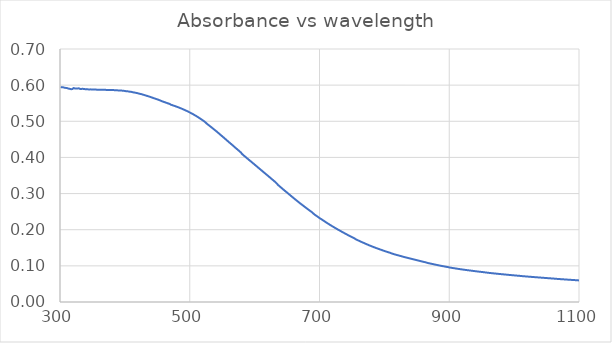
| Category | Series 0 |
|---|---|
| 1100.0 | 0.06 |
| 1099.0 | 0.06 |
| 1098.0 | 0.06 |
| 1097.0 | 0.06 |
| 1096.0 | 0.06 |
| 1095.0 | 0.06 |
| 1094.0 | 0.06 |
| 1093.0 | 0.061 |
| 1092.0 | 0.061 |
| 1091.0 | 0.061 |
| 1090.0 | 0.061 |
| 1089.0 | 0.061 |
| 1088.0 | 0.061 |
| 1087.0 | 0.061 |
| 1086.0 | 0.061 |
| 1085.0 | 0.062 |
| 1084.0 | 0.062 |
| 1083.0 | 0.062 |
| 1082.0 | 0.062 |
| 1081.0 | 0.062 |
| 1080.0 | 0.062 |
| 1079.0 | 0.062 |
| 1078.0 | 0.062 |
| 1077.0 | 0.063 |
| 1076.0 | 0.063 |
| 1075.0 | 0.063 |
| 1074.0 | 0.063 |
| 1073.0 | 0.063 |
| 1072.0 | 0.063 |
| 1071.0 | 0.063 |
| 1070.0 | 0.063 |
| 1069.0 | 0.064 |
| 1068.0 | 0.064 |
| 1067.0 | 0.064 |
| 1066.0 | 0.064 |
| 1065.0 | 0.064 |
| 1064.0 | 0.064 |
| 1063.0 | 0.065 |
| 1062.0 | 0.065 |
| 1061.0 | 0.065 |
| 1060.0 | 0.065 |
| 1059.0 | 0.065 |
| 1058.0 | 0.065 |
| 1057.0 | 0.065 |
| 1056.0 | 0.065 |
| 1055.0 | 0.066 |
| 1054.0 | 0.066 |
| 1053.0 | 0.066 |
| 1052.0 | 0.066 |
| 1051.0 | 0.066 |
| 1050.0 | 0.066 |
| 1049.0 | 0.066 |
| 1048.0 | 0.067 |
| 1047.0 | 0.067 |
| 1046.0 | 0.067 |
| 1045.0 | 0.067 |
| 1044.0 | 0.067 |
| 1043.0 | 0.067 |
| 1042.0 | 0.067 |
| 1041.0 | 0.068 |
| 1040.0 | 0.068 |
| 1039.0 | 0.068 |
| 1038.0 | 0.068 |
| 1037.0 | 0.068 |
| 1036.0 | 0.068 |
| 1035.0 | 0.068 |
| 1034.0 | 0.068 |
| 1033.0 | 0.069 |
| 1032.0 | 0.069 |
| 1031.0 | 0.069 |
| 1030.0 | 0.069 |
| 1029.0 | 0.069 |
| 1028.0 | 0.069 |
| 1027.0 | 0.069 |
| 1026.0 | 0.07 |
| 1025.0 | 0.07 |
| 1024.0 | 0.07 |
| 1023.0 | 0.07 |
| 1022.0 | 0.07 |
| 1021.0 | 0.07 |
| 1020.0 | 0.07 |
| 1019.0 | 0.071 |
| 1018.0 | 0.071 |
| 1017.0 | 0.071 |
| 1016.0 | 0.071 |
| 1015.0 | 0.071 |
| 1014.0 | 0.071 |
| 1013.0 | 0.072 |
| 1012.0 | 0.072 |
| 1011.0 | 0.072 |
| 1010.0 | 0.072 |
| 1009.0 | 0.072 |
| 1008.0 | 0.072 |
| 1007.0 | 0.073 |
| 1006.0 | 0.073 |
| 1005.0 | 0.073 |
| 1004.0 | 0.073 |
| 1003.0 | 0.073 |
| 1002.0 | 0.073 |
| 1001.0 | 0.074 |
| 1000.0 | 0.074 |
| 999.0 | 0.074 |
| 998.0 | 0.074 |
| 997.0 | 0.074 |
| 996.0 | 0.074 |
| 995.0 | 0.075 |
| 994.0 | 0.075 |
| 993.0 | 0.075 |
| 992.0 | 0.075 |
| 991.0 | 0.075 |
| 990.0 | 0.075 |
| 989.0 | 0.076 |
| 988.0 | 0.076 |
| 987.0 | 0.076 |
| 986.0 | 0.076 |
| 985.0 | 0.076 |
| 984.0 | 0.076 |
| 983.0 | 0.077 |
| 982.0 | 0.077 |
| 981.0 | 0.077 |
| 980.0 | 0.077 |
| 979.0 | 0.077 |
| 978.0 | 0.077 |
| 977.0 | 0.078 |
| 976.0 | 0.078 |
| 975.0 | 0.078 |
| 974.0 | 0.078 |
| 973.0 | 0.078 |
| 972.0 | 0.079 |
| 971.0 | 0.079 |
| 970.0 | 0.079 |
| 969.0 | 0.079 |
| 968.0 | 0.079 |
| 967.0 | 0.079 |
| 966.0 | 0.08 |
| 965.0 | 0.08 |
| 964.0 | 0.08 |
| 963.0 | 0.08 |
| 962.0 | 0.08 |
| 961.0 | 0.081 |
| 960.0 | 0.081 |
| 959.0 | 0.081 |
| 958.0 | 0.081 |
| 957.0 | 0.081 |
| 956.0 | 0.082 |
| 955.0 | 0.082 |
| 954.0 | 0.082 |
| 953.0 | 0.082 |
| 952.0 | 0.083 |
| 951.0 | 0.083 |
| 950.0 | 0.083 |
| 949.0 | 0.083 |
| 948.0 | 0.084 |
| 947.0 | 0.084 |
| 946.0 | 0.084 |
| 945.0 | 0.084 |
| 944.0 | 0.084 |
| 943.0 | 0.085 |
| 942.0 | 0.085 |
| 941.0 | 0.085 |
| 940.0 | 0.085 |
| 939.0 | 0.086 |
| 938.0 | 0.086 |
| 937.0 | 0.086 |
| 936.0 | 0.086 |
| 935.0 | 0.086 |
| 934.0 | 0.087 |
| 933.0 | 0.087 |
| 932.0 | 0.087 |
| 931.0 | 0.087 |
| 930.0 | 0.088 |
| 929.0 | 0.088 |
| 928.0 | 0.088 |
| 927.0 | 0.088 |
| 926.0 | 0.089 |
| 925.0 | 0.089 |
| 924.0 | 0.089 |
| 923.0 | 0.089 |
| 922.0 | 0.09 |
| 921.0 | 0.09 |
| 920.0 | 0.09 |
| 919.0 | 0.09 |
| 918.0 | 0.091 |
| 917.0 | 0.091 |
| 916.0 | 0.091 |
| 915.0 | 0.091 |
| 914.0 | 0.092 |
| 913.0 | 0.092 |
| 912.0 | 0.092 |
| 911.0 | 0.092 |
| 910.0 | 0.093 |
| 909.0 | 0.093 |
| 908.0 | 0.093 |
| 907.0 | 0.094 |
| 906.0 | 0.094 |
| 905.0 | 0.094 |
| 904.0 | 0.094 |
| 903.0 | 0.095 |
| 902.0 | 0.095 |
| 901.0 | 0.095 |
| 900.0 | 0.096 |
| 899.0 | 0.096 |
| 898.0 | 0.097 |
| 897.0 | 0.097 |
| 896.0 | 0.097 |
| 895.0 | 0.098 |
| 894.0 | 0.098 |
| 893.0 | 0.098 |
| 892.0 | 0.099 |
| 891.0 | 0.099 |
| 890.0 | 0.099 |
| 889.0 | 0.1 |
| 888.0 | 0.1 |
| 887.0 | 0.1 |
| 886.0 | 0.101 |
| 885.0 | 0.101 |
| 884.0 | 0.101 |
| 883.0 | 0.102 |
| 882.0 | 0.102 |
| 881.0 | 0.102 |
| 880.0 | 0.103 |
| 879.0 | 0.103 |
| 878.0 | 0.104 |
| 877.0 | 0.104 |
| 876.0 | 0.104 |
| 875.0 | 0.105 |
| 874.0 | 0.105 |
| 873.0 | 0.106 |
| 872.0 | 0.106 |
| 871.0 | 0.106 |
| 870.0 | 0.107 |
| 869.0 | 0.107 |
| 868.0 | 0.108 |
| 867.0 | 0.108 |
| 866.0 | 0.108 |
| 865.0 | 0.109 |
| 864.0 | 0.11 |
| 863.0 | 0.11 |
| 862.0 | 0.11 |
| 861.0 | 0.111 |
| 860.0 | 0.111 |
| 859.0 | 0.112 |
| 858.0 | 0.112 |
| 857.0 | 0.113 |
| 856.0 | 0.113 |
| 855.0 | 0.114 |
| 854.0 | 0.114 |
| 853.0 | 0.114 |
| 852.0 | 0.115 |
| 851.0 | 0.115 |
| 850.0 | 0.116 |
| 849.0 | 0.116 |
| 848.0 | 0.117 |
| 847.0 | 0.117 |
| 846.0 | 0.118 |
| 845.0 | 0.118 |
| 844.0 | 0.118 |
| 843.0 | 0.119 |
| 842.0 | 0.119 |
| 841.0 | 0.12 |
| 840.0 | 0.12 |
| 839.0 | 0.121 |
| 838.0 | 0.121 |
| 837.0 | 0.122 |
| 836.0 | 0.122 |
| 835.0 | 0.122 |
| 834.0 | 0.123 |
| 833.0 | 0.123 |
| 832.0 | 0.124 |
| 831.0 | 0.124 |
| 830.0 | 0.125 |
| 829.0 | 0.125 |
| 828.0 | 0.126 |
| 827.0 | 0.126 |
| 826.0 | 0.127 |
| 825.0 | 0.127 |
| 824.0 | 0.128 |
| 823.0 | 0.128 |
| 822.0 | 0.129 |
| 821.0 | 0.129 |
| 820.0 | 0.13 |
| 819.0 | 0.13 |
| 818.0 | 0.131 |
| 817.0 | 0.131 |
| 816.0 | 0.132 |
| 815.0 | 0.132 |
| 814.0 | 0.133 |
| 813.0 | 0.133 |
| 812.0 | 0.134 |
| 811.0 | 0.134 |
| 810.0 | 0.135 |
| 809.0 | 0.136 |
| 808.0 | 0.137 |
| 807.0 | 0.137 |
| 806.0 | 0.138 |
| 805.0 | 0.138 |
| 804.0 | 0.139 |
| 803.0 | 0.139 |
| 802.0 | 0.14 |
| 801.0 | 0.141 |
| 800.0 | 0.141 |
| 799.0 | 0.142 |
| 798.0 | 0.142 |
| 797.0 | 0.143 |
| 796.0 | 0.144 |
| 795.0 | 0.144 |
| 794.0 | 0.145 |
| 793.0 | 0.146 |
| 792.0 | 0.146 |
| 791.0 | 0.147 |
| 790.0 | 0.148 |
| 789.0 | 0.148 |
| 788.0 | 0.149 |
| 787.0 | 0.15 |
| 786.0 | 0.15 |
| 785.0 | 0.151 |
| 784.0 | 0.152 |
| 783.0 | 0.152 |
| 782.0 | 0.153 |
| 781.0 | 0.154 |
| 780.0 | 0.154 |
| 779.0 | 0.155 |
| 778.0 | 0.156 |
| 777.0 | 0.157 |
| 776.0 | 0.157 |
| 775.0 | 0.158 |
| 774.0 | 0.159 |
| 773.0 | 0.16 |
| 772.0 | 0.16 |
| 771.0 | 0.161 |
| 770.0 | 0.162 |
| 769.0 | 0.163 |
| 768.0 | 0.164 |
| 767.0 | 0.164 |
| 766.0 | 0.165 |
| 765.0 | 0.166 |
| 764.0 | 0.167 |
| 763.0 | 0.168 |
| 762.0 | 0.168 |
| 761.0 | 0.169 |
| 760.0 | 0.17 |
| 759.0 | 0.171 |
| 758.0 | 0.172 |
| 757.0 | 0.173 |
| 756.0 | 0.173 |
| 755.0 | 0.175 |
| 754.0 | 0.176 |
| 753.0 | 0.177 |
| 752.0 | 0.178 |
| 751.0 | 0.179 |
| 750.0 | 0.18 |
| 749.0 | 0.18 |
| 748.0 | 0.181 |
| 747.0 | 0.182 |
| 746.0 | 0.183 |
| 745.0 | 0.184 |
| 744.0 | 0.185 |
| 743.0 | 0.186 |
| 742.0 | 0.187 |
| 741.0 | 0.188 |
| 740.0 | 0.189 |
| 739.0 | 0.19 |
| 738.0 | 0.191 |
| 737.0 | 0.192 |
| 736.0 | 0.193 |
| 735.0 | 0.194 |
| 734.0 | 0.195 |
| 733.0 | 0.196 |
| 732.0 | 0.197 |
| 731.0 | 0.198 |
| 730.0 | 0.199 |
| 729.0 | 0.2 |
| 728.0 | 0.201 |
| 727.0 | 0.202 |
| 726.0 | 0.203 |
| 725.0 | 0.204 |
| 724.0 | 0.205 |
| 723.0 | 0.206 |
| 722.0 | 0.207 |
| 721.0 | 0.208 |
| 720.0 | 0.209 |
| 719.0 | 0.21 |
| 718.0 | 0.211 |
| 717.0 | 0.213 |
| 716.0 | 0.214 |
| 715.0 | 0.215 |
| 714.0 | 0.216 |
| 713.0 | 0.217 |
| 712.0 | 0.218 |
| 711.0 | 0.219 |
| 710.0 | 0.221 |
| 709.0 | 0.222 |
| 708.0 | 0.223 |
| 707.0 | 0.224 |
| 706.0 | 0.225 |
| 705.0 | 0.227 |
| 704.0 | 0.228 |
| 703.0 | 0.229 |
| 702.0 | 0.23 |
| 701.0 | 0.231 |
| 700.0 | 0.232 |
| 699.0 | 0.234 |
| 698.0 | 0.235 |
| 697.0 | 0.236 |
| 696.0 | 0.237 |
| 695.0 | 0.239 |
| 694.0 | 0.24 |
| 693.0 | 0.241 |
| 692.0 | 0.242 |
| 691.0 | 0.244 |
| 690.0 | 0.246 |
| 689.0 | 0.248 |
| 688.0 | 0.249 |
| 687.0 | 0.25 |
| 686.0 | 0.252 |
| 685.0 | 0.253 |
| 684.0 | 0.254 |
| 683.0 | 0.256 |
| 682.0 | 0.257 |
| 681.0 | 0.258 |
| 680.0 | 0.26 |
| 679.0 | 0.261 |
| 678.0 | 0.262 |
| 677.0 | 0.264 |
| 676.0 | 0.265 |
| 675.0 | 0.266 |
| 674.0 | 0.268 |
| 673.0 | 0.269 |
| 672.0 | 0.27 |
| 671.0 | 0.272 |
| 670.0 | 0.273 |
| 669.0 | 0.275 |
| 668.0 | 0.276 |
| 667.0 | 0.278 |
| 666.0 | 0.279 |
| 665.0 | 0.28 |
| 664.0 | 0.282 |
| 663.0 | 0.283 |
| 662.0 | 0.285 |
| 661.0 | 0.286 |
| 660.0 | 0.288 |
| 659.0 | 0.289 |
| 658.0 | 0.291 |
| 657.0 | 0.292 |
| 656.0 | 0.294 |
| 655.0 | 0.295 |
| 654.0 | 0.297 |
| 653.0 | 0.298 |
| 652.0 | 0.3 |
| 651.0 | 0.301 |
| 650.0 | 0.303 |
| 649.0 | 0.304 |
| 648.0 | 0.306 |
| 647.0 | 0.307 |
| 646.0 | 0.309 |
| 645.0 | 0.31 |
| 644.0 | 0.312 |
| 643.0 | 0.313 |
| 642.0 | 0.315 |
| 641.0 | 0.316 |
| 640.0 | 0.318 |
| 639.0 | 0.319 |
| 638.0 | 0.321 |
| 637.0 | 0.322 |
| 636.0 | 0.324 |
| 635.0 | 0.325 |
| 634.0 | 0.328 |
| 633.0 | 0.33 |
| 632.0 | 0.332 |
| 631.0 | 0.333 |
| 630.0 | 0.335 |
| 629.0 | 0.336 |
| 628.0 | 0.338 |
| 627.0 | 0.339 |
| 626.0 | 0.341 |
| 625.0 | 0.342 |
| 624.0 | 0.344 |
| 623.0 | 0.345 |
| 622.0 | 0.347 |
| 621.0 | 0.348 |
| 620.0 | 0.35 |
| 619.0 | 0.351 |
| 618.0 | 0.353 |
| 617.0 | 0.354 |
| 616.0 | 0.356 |
| 615.0 | 0.358 |
| 614.0 | 0.359 |
| 613.0 | 0.361 |
| 612.0 | 0.362 |
| 611.0 | 0.364 |
| 610.0 | 0.365 |
| 609.0 | 0.367 |
| 608.0 | 0.368 |
| 607.0 | 0.37 |
| 606.0 | 0.371 |
| 605.0 | 0.373 |
| 604.0 | 0.374 |
| 603.0 | 0.376 |
| 602.0 | 0.377 |
| 601.0 | 0.379 |
| 600.0 | 0.38 |
| 599.0 | 0.382 |
| 598.0 | 0.383 |
| 597.0 | 0.385 |
| 596.0 | 0.386 |
| 595.0 | 0.388 |
| 594.0 | 0.389 |
| 593.0 | 0.391 |
| 592.0 | 0.392 |
| 591.0 | 0.394 |
| 590.0 | 0.395 |
| 589.0 | 0.397 |
| 588.0 | 0.398 |
| 587.0 | 0.4 |
| 586.0 | 0.401 |
| 585.0 | 0.403 |
| 584.0 | 0.404 |
| 583.0 | 0.406 |
| 582.0 | 0.407 |
| 581.0 | 0.409 |
| 580.0 | 0.411 |
| 579.0 | 0.414 |
| 578.0 | 0.415 |
| 577.0 | 0.417 |
| 576.0 | 0.418 |
| 575.0 | 0.42 |
| 574.0 | 0.421 |
| 573.0 | 0.423 |
| 572.0 | 0.424 |
| 571.0 | 0.426 |
| 570.0 | 0.427 |
| 569.0 | 0.429 |
| 568.0 | 0.431 |
| 567.0 | 0.432 |
| 566.0 | 0.434 |
| 565.0 | 0.435 |
| 564.0 | 0.437 |
| 563.0 | 0.438 |
| 562.0 | 0.44 |
| 561.0 | 0.441 |
| 560.0 | 0.443 |
| 559.0 | 0.444 |
| 558.0 | 0.446 |
| 557.0 | 0.448 |
| 556.0 | 0.449 |
| 555.0 | 0.451 |
| 554.0 | 0.452 |
| 553.0 | 0.454 |
| 552.0 | 0.455 |
| 551.0 | 0.457 |
| 550.0 | 0.458 |
| 549.0 | 0.46 |
| 548.0 | 0.462 |
| 547.0 | 0.463 |
| 546.0 | 0.465 |
| 545.0 | 0.466 |
| 544.0 | 0.468 |
| 543.0 | 0.469 |
| 542.0 | 0.471 |
| 541.0 | 0.472 |
| 540.0 | 0.474 |
| 539.0 | 0.475 |
| 538.0 | 0.477 |
| 537.0 | 0.478 |
| 536.0 | 0.48 |
| 535.0 | 0.481 |
| 534.0 | 0.483 |
| 533.0 | 0.484 |
| 532.0 | 0.485 |
| 531.0 | 0.487 |
| 530.0 | 0.488 |
| 529.0 | 0.49 |
| 528.0 | 0.491 |
| 527.0 | 0.492 |
| 526.0 | 0.494 |
| 525.0 | 0.496 |
| 524.0 | 0.498 |
| 523.0 | 0.499 |
| 522.0 | 0.5 |
| 521.0 | 0.501 |
| 520.0 | 0.503 |
| 519.0 | 0.504 |
| 518.0 | 0.505 |
| 517.0 | 0.506 |
| 516.0 | 0.508 |
| 515.0 | 0.509 |
| 514.0 | 0.51 |
| 513.0 | 0.511 |
| 512.0 | 0.512 |
| 511.0 | 0.513 |
| 510.0 | 0.515 |
| 509.0 | 0.516 |
| 508.0 | 0.517 |
| 507.0 | 0.518 |
| 506.0 | 0.519 |
| 505.0 | 0.52 |
| 504.0 | 0.521 |
| 503.0 | 0.522 |
| 502.0 | 0.523 |
| 501.0 | 0.524 |
| 500.0 | 0.524 |
| 499.0 | 0.525 |
| 498.0 | 0.526 |
| 497.0 | 0.527 |
| 496.0 | 0.528 |
| 495.0 | 0.529 |
| 494.0 | 0.53 |
| 493.0 | 0.531 |
| 492.0 | 0.531 |
| 491.0 | 0.532 |
| 490.0 | 0.533 |
| 489.0 | 0.534 |
| 488.0 | 0.535 |
| 487.0 | 0.535 |
| 486.0 | 0.536 |
| 485.0 | 0.537 |
| 484.0 | 0.537 |
| 483.0 | 0.538 |
| 482.0 | 0.539 |
| 481.0 | 0.54 |
| 480.0 | 0.54 |
| 479.0 | 0.541 |
| 478.0 | 0.541 |
| 477.0 | 0.542 |
| 476.0 | 0.543 |
| 475.0 | 0.543 |
| 474.0 | 0.544 |
| 473.0 | 0.545 |
| 472.0 | 0.545 |
| 471.0 | 0.546 |
| 470.0 | 0.547 |
| 469.0 | 0.548 |
| 468.0 | 0.549 |
| 467.0 | 0.549 |
| 466.0 | 0.55 |
| 465.0 | 0.55 |
| 464.0 | 0.551 |
| 463.0 | 0.552 |
| 462.0 | 0.552 |
| 461.0 | 0.553 |
| 460.0 | 0.554 |
| 459.0 | 0.554 |
| 458.0 | 0.555 |
| 457.0 | 0.556 |
| 456.0 | 0.556 |
| 455.0 | 0.557 |
| 454.0 | 0.558 |
| 453.0 | 0.559 |
| 452.0 | 0.559 |
| 451.0 | 0.56 |
| 450.0 | 0.561 |
| 449.0 | 0.561 |
| 448.0 | 0.562 |
| 447.0 | 0.562 |
| 446.0 | 0.563 |
| 445.0 | 0.564 |
| 444.0 | 0.564 |
| 443.0 | 0.565 |
| 442.0 | 0.566 |
| 441.0 | 0.566 |
| 440.0 | 0.567 |
| 439.0 | 0.568 |
| 438.0 | 0.568 |
| 437.0 | 0.569 |
| 436.0 | 0.569 |
| 435.0 | 0.57 |
| 434.0 | 0.57 |
| 433.0 | 0.571 |
| 432.0 | 0.572 |
| 431.0 | 0.572 |
| 430.0 | 0.573 |
| 429.0 | 0.573 |
| 428.0 | 0.574 |
| 427.0 | 0.574 |
| 426.0 | 0.575 |
| 425.0 | 0.575 |
| 424.0 | 0.576 |
| 423.0 | 0.576 |
| 422.0 | 0.577 |
| 421.0 | 0.577 |
| 420.0 | 0.577 |
| 419.0 | 0.578 |
| 418.0 | 0.578 |
| 417.0 | 0.579 |
| 416.0 | 0.579 |
| 415.0 | 0.579 |
| 414.0 | 0.58 |
| 413.0 | 0.58 |
| 412.0 | 0.581 |
| 411.0 | 0.581 |
| 410.0 | 0.581 |
| 409.0 | 0.582 |
| 408.0 | 0.582 |
| 407.0 | 0.582 |
| 406.0 | 0.582 |
| 405.0 | 0.583 |
| 404.0 | 0.583 |
| 403.0 | 0.583 |
| 402.0 | 0.583 |
| 401.0 | 0.584 |
| 400.0 | 0.584 |
| 399.0 | 0.584 |
| 398.0 | 0.584 |
| 397.0 | 0.585 |
| 396.0 | 0.585 |
| 395.0 | 0.585 |
| 394.0 | 0.585 |
| 393.0 | 0.585 |
| 392.0 | 0.585 |
| 391.0 | 0.585 |
| 390.0 | 0.586 |
| 389.0 | 0.586 |
| 388.0 | 0.586 |
| 387.0 | 0.586 |
| 386.0 | 0.586 |
| 385.0 | 0.586 |
| 384.0 | 0.586 |
| 383.0 | 0.586 |
| 382.0 | 0.586 |
| 381.0 | 0.586 |
| 380.0 | 0.587 |
| 379.0 | 0.586 |
| 378.0 | 0.587 |
| 377.0 | 0.587 |
| 376.0 | 0.587 |
| 375.0 | 0.586 |
| 374.0 | 0.587 |
| 373.0 | 0.586 |
| 372.0 | 0.587 |
| 371.0 | 0.587 |
| 370.0 | 0.587 |
| 369.0 | 0.587 |
| 368.0 | 0.587 |
| 367.0 | 0.587 |
| 366.0 | 0.587 |
| 365.0 | 0.587 |
| 364.0 | 0.587 |
| 363.0 | 0.587 |
| 362.0 | 0.587 |
| 361.0 | 0.587 |
| 360.0 | 0.587 |
| 359.0 | 0.588 |
| 358.0 | 0.588 |
| 357.0 | 0.587 |
| 356.0 | 0.588 |
| 355.0 | 0.588 |
| 354.0 | 0.588 |
| 353.0 | 0.588 |
| 352.0 | 0.588 |
| 351.0 | 0.588 |
| 350.0 | 0.588 |
| 349.0 | 0.588 |
| 348.0 | 0.588 |
| 347.0 | 0.588 |
| 346.0 | 0.588 |
| 345.0 | 0.588 |
| 344.0 | 0.588 |
| 343.0 | 0.588 |
| 342.0 | 0.589 |
| 341.0 | 0.589 |
| 340.0 | 0.589 |
| 339.0 | 0.589 |
| 338.0 | 0.589 |
| 337.0 | 0.589 |
| 336.0 | 0.59 |
| 335.0 | 0.59 |
| 334.0 | 0.59 |
| 333.0 | 0.59 |
| 332.0 | 0.59 |
| 331.0 | 0.589 |
| 330.0 | 0.59 |
| 329.0 | 0.591 |
| 328.0 | 0.59 |
| 327.0 | 0.591 |
| 326.0 | 0.591 |
| 325.0 | 0.591 |
| 324.0 | 0.591 |
| 323.0 | 0.591 |
| 322.0 | 0.593 |
| 321.0 | 0.592 |
| 320.0 | 0.593 |
| 319.0 | 0.589 |
| 318.0 | 0.589 |
| 317.0 | 0.589 |
| 316.0 | 0.59 |
| 315.0 | 0.59 |
| 314.0 | 0.59 |
| 313.0 | 0.59 |
| 312.0 | 0.591 |
| 311.0 | 0.592 |
| 310.0 | 0.592 |
| 309.0 | 0.592 |
| 308.0 | 0.593 |
| 307.0 | 0.593 |
| 306.0 | 0.594 |
| 305.0 | 0.594 |
| 304.0 | 0.593 |
| 303.0 | 0.594 |
| 302.0 | 0.594 |
| 301.0 | 0.595 |